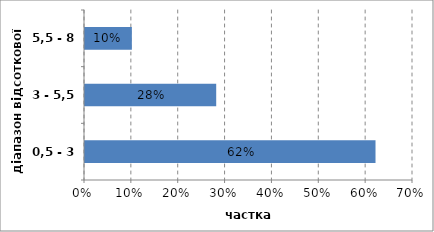
| Category | Series 0 |
|---|---|
| 0,5 - 3 | 0.62 |
| 3 - 5,5 | 0.28 |
| 5,5 - 8 | 0.1 |